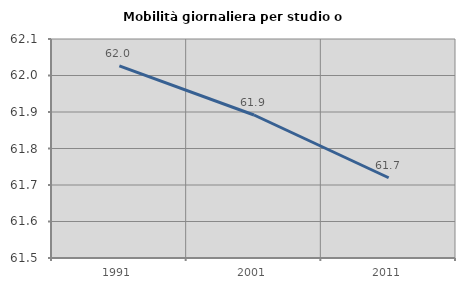
| Category | Mobilità giornaliera per studio o lavoro |
|---|---|
| 1991.0 | 62.026 |
| 2001.0 | 61.892 |
| 2011.0 | 61.72 |